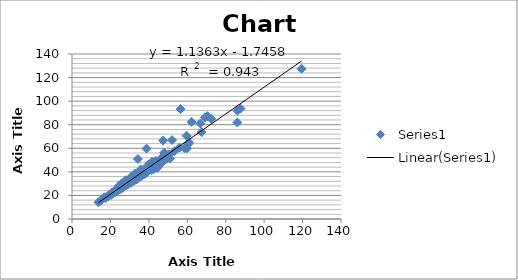
| Category | Series 0 |
|---|---|
| 18.7235840353811 | 19.026 |
| 22.6314454099536 | 23.232 |
| 29.7284330322664 | 32.006 |
| 34.0276402632517 | 34.091 |
| 25.4217494560677 | 26.064 |
| 20.5365630571 | 20.828 |
| 43.3540555823007 | 46.13 |
| 31.4681154326111 | 33.943 |
| 119.473221067069 | 127.452 |
| 23.4481416610926 | 24.995 |
| 44.4469263422224 | 43.447 |
| 41.9179056074551 | 45.057 |
| 17.1898723880459 | 17.876 |
| 41.3952068769084 | 41.591 |
| 38.5940710740631 | 38.952 |
| 22.6307921034889 | 23.098 |
| 60.606827366509 | 63.792 |
| 26.3220461552909 | 26.399 |
| 42.7738233831952 | 42.379 |
| 38.8272029083866 | 59.724 |
| 87.7297840750018 | 93.687 |
| 29.1277796871761 | 30.988 |
| 39.8307128431326 | 46.268 |
| 35.7248419205902 | 42.037 |
| 37.6968012751139 | 41.373 |
| 29.8499060262703 | 33.717 |
| 38.1229273833983 | 38.793 |
| 29.6794863231548 | 32.419 |
| 86.0421447901825 | 81.885 |
| 46.5388550538 | 47.362 |
| 36.002737625433 | 37.696 |
| 28.9725377961367 | 29.355 |
| 38.5968080366321 | 42.239 |
| 44.0743620238268 | 47.812 |
| 50.254769826439 | 54.728 |
| 20.3921205476542 | 20.507 |
| 52.0695170972921 | 66.964 |
| 20.8932479221724 | 22.582 |
| 58.6061969871338 | 59.949 |
| 28.6799773235724 | 29.182 |
| 45.4464098176406 | 46.086 |
| 23.5942378827938 | 24.745 |
| 34.4859270637544 | 35.964 |
| 39.1947496875171 | 40.418 |
| 25.4710727718756 | 28.113 |
| 30.9537565705919 | 31.772 |
| 18.916516381434 | 19.558 |
| 27.1719123481119 | 28.543 |
| 21.3647228067326 | 21.704 |
| 19.0391015462528 | 20.145 |
| 29.3227081167868 | 31.155 |
| 23.1664536512358 | 24.347 |
| 13.7391774278159 | 14.201 |
| 32.1897551937852 | 32.735 |
| 60.9005420722674 | 65.048 |
| 27.9831326576518 | 28.439 |
| 59.8491039858969 | 59.926 |
| 23.7544210258399 | 24.411 |
| 28.9460793360452 | 31.952 |
| 32.8041774510983 | 38.474 |
| 42.6229884763982 | 43.307 |
| 43.0783331068397 | 44.726 |
| 32.0999720155794 | 32.831 |
| 25.7972523891098 | 30.074 |
| 29.3706080557541 | 29.731 |
| 27.9011086287698 | 32.889 |
| 22.2069779884702 | 22.818 |
| 42.811808183563 | 45.132 |
| 36.0636851088766 | 37.492 |
| 23.8258421494311 | 24.283 |
| 69.2134748603732 | 86.271 |
| 44.4185201906309 | 44.157 |
| 22.8496812588371 | 24.775 |
| 66.808309625552 | 81.123 |
| 32.2756581061137 | 32.869 |
| 46.7047087311286 | 50.75 |
| 59.6333470243503 | 70.641 |
| 53.3084505080608 | 57.517 |
| 30.0001875953704 | 33.901 |
| 47.9727722069926 | 56.234 |
| 24.2946059165477 | 25.142 |
| 35.9829945209808 | 38.893 |
| 20.9448731281321 | 21.579 |
| 26.7302659880439 | 27.759 |
| 31.3976466260136 | 32.467 |
| 70.5119532049325 | 87.29 |
| 17.4812379092736 | 18.383 |
| 23.7714411987323 | 26.354 |
| 16.6394458735496 | 18.355 |
| 21.6655883290732 | 22.856 |
| 20.3072870390359 | 21.409 |
| 27.1246557883532 | 28.812 |
| 67.4925029990931 | 73.707 |
| 37.1241311102959 | 41.918 |
| 33.3983527085627 | 35.463 |
| 17.639202311648 | 18.303 |
| 17.3146437800176 | 18.028 |
| 22.4911621311361 | 24.434 |
| 27.3495975710013 | 28.741 |
| 24.33586881213 | 27.353 |
| 25.1341842346207 | 27.065 |
| 36.2357670417775 | 36.509 |
| 42.935688085035 | 44.471 |
| 14.9909478103319 | 15.516 |
| 25.4354333160991 | 25.677 |
| 33.4569420372252 | 33.518 |
| 37.3631830475206 | 37.714 |
| 24.5614193937283 | 28.37 |
| 23.5399192771863 | 24.767 |
| 38.2096490369141 | 40.728 |
| 32.5569210372097 | 35.752 |
| 50.1531160459588 | 54.488 |
| 27.2865223426332 | 28.551 |
| 34.2908093594281 | 50.862 |
| 26.9934079136057 | 28.525 |
| 43.5403216560116 | 47.028 |
| 40.4810450847116 | 41.834 |
| 38.582303935885 | 42.253 |
| 30.7968475990281 | 30.72 |
| 72.4655825074604 | 85.019 |
| 24.7389707171288 | 24.982 |
| 62.2303791708749 | 82.301 |
| 37.3257484389668 | 39.569 |
| 56.5048548859829 | 93.243 |
| 50.9745275052617 | 51.205 |
| 26.7176707419543 | 27.708 |
| 44.2556992649497 | 46.967 |
| 28.0527549288013 | 30.182 |
| 32.5404440385333 | 34.489 |
| 86.0470003291653 | 91.896 |
| 41.6246066430378 | 46.311 |
| 42.2595848195287 | 47.849 |
| 43.7624284508337 | 49.23 |
| 49.2421880154158 | 51.106 |
| 55.9454748459649 | 60.559 |
| 41.7063613984698 | 48.621 |
| 32.7321242372749 | 33.045 |
| 31.0605672678004 | 36.157 |
| 46.3808617142099 | 51.584 |
| 47.441672657382 | 66.528 |
| 30.9827330609603 | 31.272 |
| 27.8881201472564 | 30.106 |
| 47.8362792905235 | 53.291 |
| 36.3480605580662 | 37.757 |
| 26.4920694102706 | 28.322 |
| 22.6996444502366 | 23.294 |
| 39.0840043205989 | 41.123 |